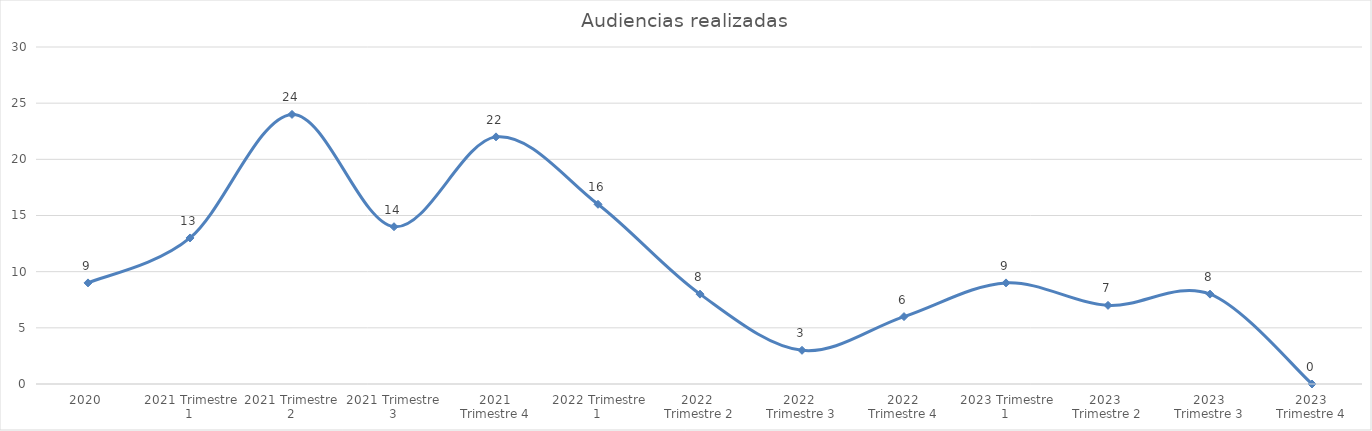
| Category | Series 0 |
|---|---|
| 2020 | 9 |
|  2021 Trimestre 1 | 13 |
| 2021 Trimestre 2 | 24 |
| 2021 Trimestre 3 | 14 |
| 2021
Trimestre 4 | 22 |
|  2022 Trimestre 1 | 16 |
| 2022 
Trimestre 2 | 8 |
| 2022 
Trimestre 3 | 3 |
| 2022
Trimestre 4 | 6 |
|  2023 Trimestre 1 | 9 |
| 2023 
Trimestre 2 | 7 |
| 2023
Trimestre 3 | 8 |
| 2023
Trimestre 4 | 0 |